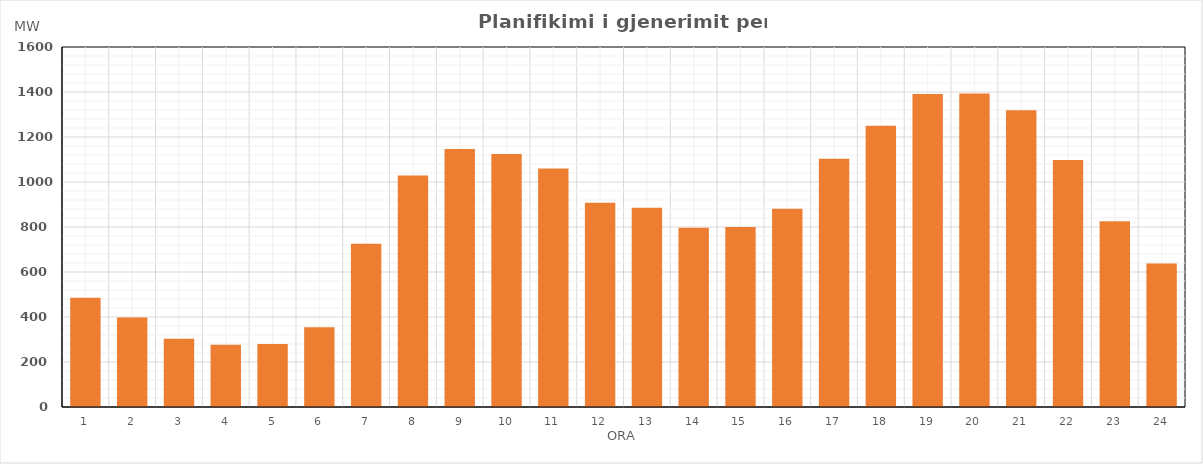
| Category | Max (MW) |
|---|---|
| 0 | 485.02 |
| 1 | 398.02 |
| 2 | 303.02 |
| 3 | 277.02 |
| 4 | 280.02 |
| 5 | 354.161 |
| 6 | 726.02 |
| 7 | 1029.02 |
| 8 | 1147.043 |
| 9 | 1124.901 |
| 10 | 1059.632 |
| 11 | 907.46 |
| 12 | 885.02 |
| 13 | 797.02 |
| 14 | 800.02 |
| 15 | 881.02 |
| 16 | 1103.14 |
| 17 | 1249.914 |
| 18 | 1390.691 |
| 19 | 1393.753 |
| 20 | 1318.633 |
| 21 | 1098.005 |
| 22 | 825.863 |
| 23 | 637.781 |